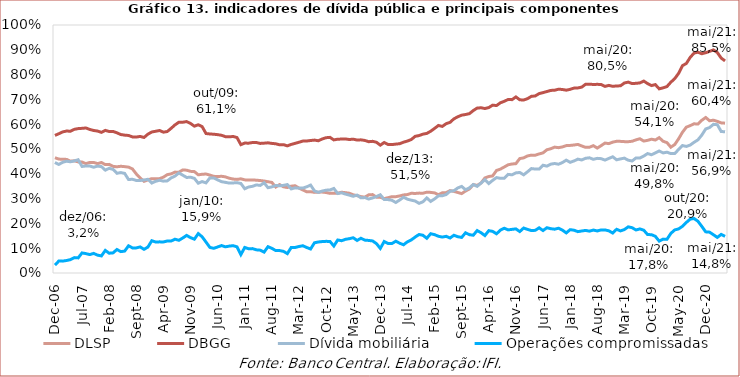
| Category | DLSP | DBGG | Dívida mobiliária | Operações compromissadas |
|---|---|---|---|---|
| 2006-12-01 | 0.465 | 0.555 | 0.446 | 0.032 |
| 2007-01-01 | 0.459 | 0.562 | 0.438 | 0.048 |
| 2007-02-01 | 0.459 | 0.569 | 0.446 | 0.048 |
| 2007-03-01 | 0.458 | 0.572 | 0.451 | 0.05 |
| 2007-04-01 | 0.451 | 0.572 | 0.448 | 0.054 |
| 2007-05-01 | 0.452 | 0.579 | 0.452 | 0.062 |
| 2007-06-01 | 0.448 | 0.582 | 0.457 | 0.061 |
| 2007-07-01 | 0.447 | 0.583 | 0.43 | 0.081 |
| 2007-08-01 | 0.441 | 0.585 | 0.432 | 0.078 |
| 2007-09-01 | 0.446 | 0.579 | 0.431 | 0.074 |
| 2007-10-01 | 0.446 | 0.575 | 0.427 | 0.079 |
| 2007-11-01 | 0.441 | 0.572 | 0.431 | 0.072 |
| 2007-12-01 | 0.445 | 0.567 | 0.429 | 0.069 |
| 2008-01-01 | 0.437 | 0.575 | 0.415 | 0.091 |
| 2008-02-01 | 0.438 | 0.57 | 0.422 | 0.08 |
| 2008-03-01 | 0.43 | 0.571 | 0.418 | 0.081 |
| 2008-04-01 | 0.428 | 0.565 | 0.402 | 0.095 |
| 2008-05-01 | 0.43 | 0.558 | 0.405 | 0.086 |
| 2008-06-01 | 0.429 | 0.556 | 0.402 | 0.088 |
| 2008-07-01 | 0.427 | 0.555 | 0.377 | 0.11 |
| 2008-08-01 | 0.42 | 0.549 | 0.378 | 0.101 |
| 2008-09-01 | 0.4 | 0.548 | 0.373 | 0.101 |
| 2008-10-01 | 0.383 | 0.551 | 0.373 | 0.105 |
| 2008-11-01 | 0.37 | 0.547 | 0.375 | 0.095 |
| 2008-12-01 | 0.376 | 0.56 | 0.378 | 0.105 |
| 2009-01-01 | 0.38 | 0.569 | 0.363 | 0.13 |
| 2009-02-01 | 0.38 | 0.572 | 0.37 | 0.125 |
| 2009-03-01 | 0.38 | 0.575 | 0.374 | 0.126 |
| 2009-04-01 | 0.386 | 0.568 | 0.37 | 0.125 |
| 2009-05-01 | 0.397 | 0.571 | 0.371 | 0.129 |
| 2009-06-01 | 0.4 | 0.583 | 0.383 | 0.129 |
| 2009-07-01 | 0.407 | 0.597 | 0.391 | 0.136 |
| 2009-08-01 | 0.407 | 0.608 | 0.403 | 0.132 |
| 2009-09-01 | 0.416 | 0.608 | 0.394 | 0.141 |
| 2009-10-01 | 0.415 | 0.611 | 0.385 | 0.152 |
| 2009-11-01 | 0.41 | 0.603 | 0.386 | 0.143 |
| 2009-12-01 | 0.409 | 0.592 | 0.382 | 0.136 |
| 2010-01-01 | 0.396 | 0.598 | 0.362 | 0.159 |
| 2010-02-01 | 0.398 | 0.59 | 0.369 | 0.146 |
| 2010-03-01 | 0.399 | 0.562 | 0.364 | 0.125 |
| 2010-04-01 | 0.395 | 0.561 | 0.383 | 0.103 |
| 2010-05-01 | 0.39 | 0.56 | 0.384 | 0.1 |
| 2010-06-01 | 0.389 | 0.558 | 0.376 | 0.105 |
| 2010-07-01 | 0.39 | 0.555 | 0.368 | 0.111 |
| 2010-08-01 | 0.388 | 0.55 | 0.366 | 0.106 |
| 2010-09-01 | 0.382 | 0.549 | 0.363 | 0.108 |
| 2010-10-01 | 0.379 | 0.551 | 0.363 | 0.11 |
| 2010-11-01 | 0.377 | 0.546 | 0.364 | 0.106 |
| 2010-12-01 | 0.38 | 0.518 | 0.361 | 0.074 |
| 2011-01-01 | 0.376 | 0.524 | 0.34 | 0.103 |
| 2011-02-01 | 0.375 | 0.524 | 0.347 | 0.098 |
| 2011-03-01 | 0.375 | 0.526 | 0.35 | 0.098 |
| 2011-04-01 | 0.374 | 0.526 | 0.355 | 0.093 |
| 2011-05-01 | 0.373 | 0.523 | 0.353 | 0.092 |
| 2011-06-01 | 0.371 | 0.524 | 0.364 | 0.084 |
| 2011-07-01 | 0.368 | 0.525 | 0.344 | 0.106 |
| 2011-08-01 | 0.365 | 0.523 | 0.347 | 0.1 |
| 2011-09-01 | 0.347 | 0.521 | 0.353 | 0.09 |
| 2011-10-01 | 0.356 | 0.517 | 0.352 | 0.09 |
| 2011-11-01 | 0.348 | 0.517 | 0.353 | 0.087 |
| 2011-12-01 | 0.345 | 0.513 | 0.357 | 0.078 |
| 2012-01-01 | 0.35 | 0.519 | 0.339 | 0.103 |
| 2012-02-01 | 0.352 | 0.523 | 0.343 | 0.103 |
| 2012-03-01 | 0.343 | 0.527 | 0.342 | 0.107 |
| 2012-04-01 | 0.335 | 0.532 | 0.342 | 0.11 |
| 2012-05-01 | 0.327 | 0.532 | 0.347 | 0.103 |
| 2012-06-01 | 0.328 | 0.534 | 0.355 | 0.097 |
| 2012-07-01 | 0.325 | 0.536 | 0.331 | 0.122 |
| 2012-08-01 | 0.326 | 0.533 | 0.325 | 0.125 |
| 2012-09-01 | 0.326 | 0.54 | 0.33 | 0.127 |
| 2012-10-01 | 0.325 | 0.546 | 0.334 | 0.128 |
| 2012-11-01 | 0.321 | 0.547 | 0.335 | 0.127 |
| 2012-12-01 | 0.322 | 0.537 | 0.341 | 0.109 |
| 2013-01-01 | 0.322 | 0.54 | 0.321 | 0.133 |
| 2013-02-01 | 0.326 | 0.54 | 0.323 | 0.13 |
| 2013-03-01 | 0.324 | 0.541 | 0.318 | 0.136 |
| 2013-04-01 | 0.322 | 0.538 | 0.314 | 0.138 |
| 2013-05-01 | 0.315 | 0.54 | 0.309 | 0.142 |
| 2013-06-01 | 0.312 | 0.536 | 0.314 | 0.131 |
| 2013-07-01 | 0.308 | 0.537 | 0.303 | 0.14 |
| 2013-08-01 | 0.306 | 0.534 | 0.304 | 0.133 |
| 2013-09-01 | 0.315 | 0.529 | 0.298 | 0.131 |
| 2013-10-01 | 0.316 | 0.531 | 0.303 | 0.129 |
| 2013-11-01 | 0.306 | 0.527 | 0.308 | 0.118 |
| 2013-12-01 | 0.305 | 0.515 | 0.315 | 0.099 |
| 2014-01-01 | 0.3 | 0.526 | 0.296 | 0.127 |
| 2014-02-01 | 0.304 | 0.518 | 0.296 | 0.119 |
| 2014-03-01 | 0.308 | 0.518 | 0.293 | 0.119 |
| 2014-04-01 | 0.308 | 0.52 | 0.284 | 0.128 |
| 2014-05-01 | 0.311 | 0.521 | 0.294 | 0.12 |
| 2014-06-01 | 0.315 | 0.527 | 0.305 | 0.114 |
| 2014-07-01 | 0.316 | 0.532 | 0.298 | 0.126 |
| 2014-08-01 | 0.321 | 0.538 | 0.294 | 0.133 |
| 2014-09-01 | 0.321 | 0.551 | 0.29 | 0.145 |
| 2014-10-01 | 0.322 | 0.554 | 0.281 | 0.155 |
| 2014-11-01 | 0.322 | 0.56 | 0.287 | 0.152 |
| 2014-12-01 | 0.326 | 0.563 | 0.303 | 0.14 |
| 2015-01-01 | 0.325 | 0.572 | 0.289 | 0.158 |
| 2015-02-01 | 0.323 | 0.583 | 0.299 | 0.155 |
| 2015-03-01 | 0.316 | 0.595 | 0.311 | 0.148 |
| 2015-04-01 | 0.323 | 0.591 | 0.311 | 0.145 |
| 2015-05-01 | 0.324 | 0.602 | 0.316 | 0.148 |
| 2015-06-01 | 0.332 | 0.607 | 0.33 | 0.141 |
| 2015-07-01 | 0.329 | 0.622 | 0.332 | 0.152 |
| 2015-08-01 | 0.325 | 0.63 | 0.343 | 0.146 |
| 2015-09-01 | 0.32 | 0.636 | 0.349 | 0.144 |
| 2015-10-01 | 0.33 | 0.639 | 0.336 | 0.162 |
| 2015-11-01 | 0.339 | 0.643 | 0.343 | 0.155 |
| 2015-12-01 | 0.356 | 0.655 | 0.357 | 0.152 |
| 2016-01-01 | 0.353 | 0.665 | 0.349 | 0.171 |
| 2016-02-01 | 0.363 | 0.666 | 0.362 | 0.162 |
| 2016-03-01 | 0.383 | 0.663 | 0.376 | 0.151 |
| 2016-04-01 | 0.389 | 0.667 | 0.361 | 0.171 |
| 2016-05-01 | 0.391 | 0.677 | 0.373 | 0.168 |
| 2016-06-01 | 0.413 | 0.675 | 0.385 | 0.158 |
| 2016-07-01 | 0.419 | 0.686 | 0.382 | 0.173 |
| 2016-08-01 | 0.427 | 0.692 | 0.382 | 0.18 |
| 2016-09-01 | 0.436 | 0.7 | 0.398 | 0.174 |
| 2016-10-01 | 0.44 | 0.699 | 0.396 | 0.176 |
| 2016-11-01 | 0.441 | 0.71 | 0.404 | 0.178 |
| 2016-12-01 | 0.461 | 0.698 | 0.405 | 0.167 |
| 2017-01-01 | 0.464 | 0.697 | 0.396 | 0.181 |
| 2017-02-01 | 0.472 | 0.703 | 0.408 | 0.176 |
| 2017-03-01 | 0.475 | 0.712 | 0.421 | 0.171 |
| 2017-04-01 | 0.475 | 0.714 | 0.419 | 0.172 |
| 2017-05-01 | 0.48 | 0.723 | 0.419 | 0.182 |
| 2017-06-01 | 0.484 | 0.727 | 0.435 | 0.171 |
| 2017-07-01 | 0.497 | 0.732 | 0.431 | 0.183 |
| 2017-08-01 | 0.501 | 0.736 | 0.439 | 0.179 |
| 2017-09-01 | 0.508 | 0.737 | 0.442 | 0.177 |
| 2017-10-01 | 0.505 | 0.741 | 0.439 | 0.181 |
| 2017-11-01 | 0.508 | 0.74 | 0.445 | 0.173 |
| 2017-12-01 | 0.514 | 0.737 | 0.455 | 0.162 |
| 2018-01-01 | 0.514 | 0.741 | 0.446 | 0.175 |
| 2018-02-01 | 0.516 | 0.746 | 0.452 | 0.173 |
| 2018-03-01 | 0.518 | 0.746 | 0.459 | 0.167 |
| 2018-04-01 | 0.512 | 0.75 | 0.456 | 0.169 |
| 2018-05-01 | 0.507 | 0.761 | 0.463 | 0.172 |
| 2018-06-01 | 0.507 | 0.762 | 0.464 | 0.169 |
| 2018-07-01 | 0.513 | 0.76 | 0.458 | 0.173 |
| 2018-08-01 | 0.504 | 0.761 | 0.462 | 0.17 |
| 2018-09-01 | 0.513 | 0.76 | 0.461 | 0.174 |
| 2018-10-01 | 0.524 | 0.753 | 0.455 | 0.174 |
| 2018-11-01 | 0.522 | 0.756 | 0.462 | 0.17 |
| 2018-12-01 | 0.528 | 0.753 | 0.469 | 0.161 |
| 2019-01-01 | 0.531 | 0.754 | 0.456 | 0.176 |
| 2019-02-01 | 0.531 | 0.755 | 0.46 | 0.17 |
| 2019-03-01 | 0.53 | 0.766 | 0.463 | 0.175 |
| 2019-04-01 | 0.53 | 0.77 | 0.455 | 0.186 |
| 2019-05-01 | 0.531 | 0.764 | 0.452 | 0.183 |
| 2019-06-01 | 0.537 | 0.765 | 0.464 | 0.173 |
| 2019-07-01 | 0.541 | 0.766 | 0.464 | 0.178 |
| 2019-08-01 | 0.532 | 0.774 | 0.471 | 0.173 |
| 2019-09-01 | 0.535 | 0.764 | 0.482 | 0.155 |
| 2019-10-01 | 0.54 | 0.756 | 0.477 | 0.155 |
| 2019-11-01 | 0.536 | 0.76 | 0.484 | 0.148 |
| 2019-12-01 | 0.546 | 0.743 | 0.492 | 0.128 |
| 2020-01-01 | 0.531 | 0.747 | 0.484 | 0.137 |
| 2020-02-01 | 0.526 | 0.752 | 0.487 | 0.136 |
| 2020-03-01 | 0.507 | 0.769 | 0.481 | 0.16 |
| 2020-04-01 | 0.518 | 0.784 | 0.482 | 0.174 |
| 2020-05-01 | 0.541 | 0.805 | 0.498 | 0.178 |
| 2020-06-01 | 0.567 | 0.836 | 0.514 | 0.188 |
| 2020-07-01 | 0.588 | 0.845 | 0.51 | 0.204 |
| 2020-08-01 | 0.594 | 0.869 | 0.516 | 0.217 |
| 2020-09-01 | 0.602 | 0.887 | 0.527 | 0.22 |
| 2020-10-01 | 0.601 | 0.89 | 0.537 | 0.209 |
| 2020-11-01 | 0.616 | 0.884 | 0.556 | 0.188 |
| 2020-12-01 | 0.627 | 0.888 | 0.581 | 0.166 |
| 2021-01-01 | 0.614 | 0.894 | 0.587 | 0.165 |
| 2021-02-01 | 0.616 | 0.9 | 0.599 | 0.154 |
| 2021-03-01 | 0.611 | 0.889 | 0.598 | 0.144 |
| 2021-04-01 | 0.605 | 0.867 | 0.571 | 0.156 |
| 2021-05-01 | 0.604 | 0.855 | 0.569 | 0.148 |